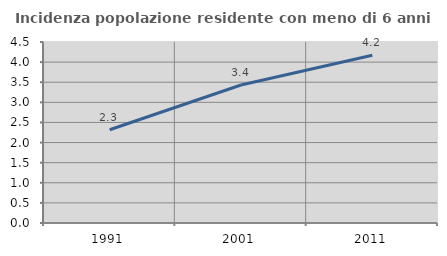
| Category | Incidenza popolazione residente con meno di 6 anni |
|---|---|
| 1991.0 | 2.318 |
| 2001.0 | 3.431 |
| 2011.0 | 4.17 |